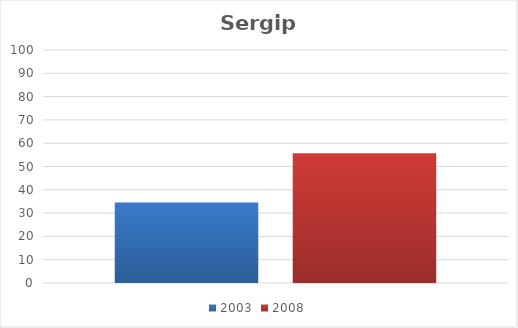
| Category | 2003 | 2008 |
|---|---|---|
| Total | 34.6 | 55.7 |